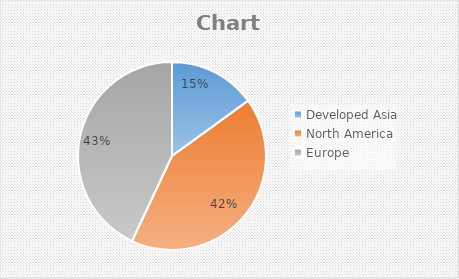
| Category | Series 0 |
|---|---|
| Developed Asia  | 0.15 |
| North America  | 0.42 |
| Europe  | 0.43 |